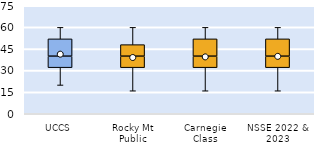
| Category | 25th | 50th | 75th |
|---|---|---|---|
| UCCS | 32 | 8 | 12 |
| Rocky Mt Public | 32 | 8 | 8 |
| Carnegie Class | 32 | 8 | 12 |
| NSSE 2022 & 2023 | 32 | 8 | 12 |